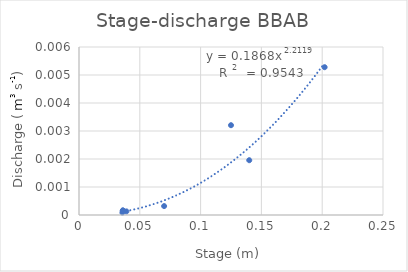
| Category | QA (m3/s) |
|---|---|
| 0.039 | 0 |
| 0.03604504 | 0 |
| 0.03604504 | 0 |
| 0.03570000000000002 | 0 |
| 0.14 | 0.002 |
| 0.07 | 0 |
| 0.202 | 0.005 |
| 0.125 | 0.003 |